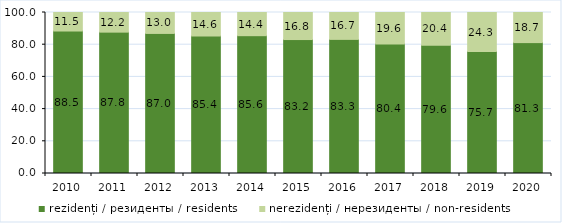
| Category | rezidenți / резиденты / residents | nerezidenți / нерезиденты / non-residents |
|---|---|---|
| 2010.0 | 88.5 | 11.5 |
| 2011.0 | 87.8 | 12.2 |
| 2012.0 | 87 | 13 |
| 2013.0 | 85.4 | 14.6 |
| 2014.0 | 85.6 | 14.4 |
| 2015.0 | 83.2 | 16.8 |
| 2016.0 | 83.3 | 16.7 |
| 2017.0 | 80.4 | 19.6 |
| 2018.0 | 79.6 | 20.4 |
| 2019.0 | 75.7 | 24.3 |
| 2020.0 | 81.3 | 18.7 |